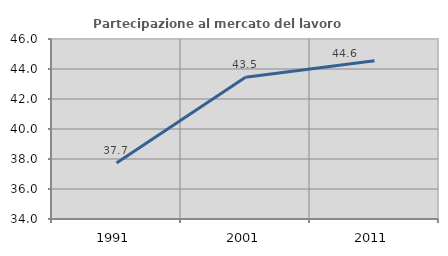
| Category | Partecipazione al mercato del lavoro  femminile |
|---|---|
| 1991.0 | 37.732 |
| 2001.0 | 43.453 |
| 2011.0 | 44.555 |